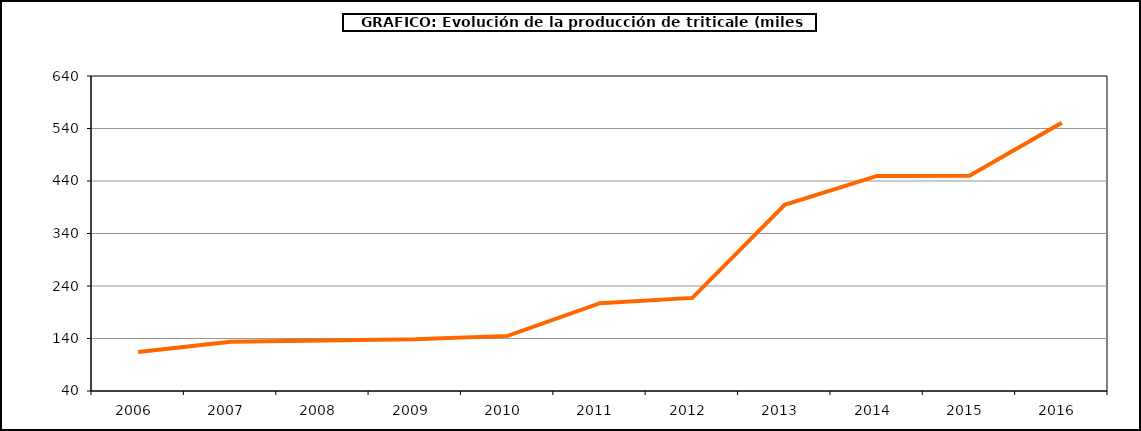
| Category | Producción |
|---|---|
| 2006.0 | 114.317 |
| 2007.0 | 133.75 |
| 2008.0 | 136.246 |
| 2009.0 | 138.491 |
| 2010.0 | 144.991 |
| 2011.0 | 207.218 |
| 2012.0 | 217.311 |
| 2013.0 | 394.752 |
| 2014.0 | 449.675 |
| 2015.0 | 449.983 |
| 2016.0 | 550.838 |